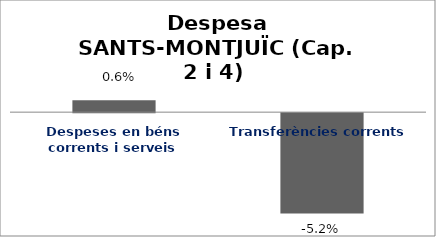
| Category | Series 0 |
|---|---|
| Despeses en béns corrents i serveis | 0.006 |
| Transferències corrents | -0.052 |